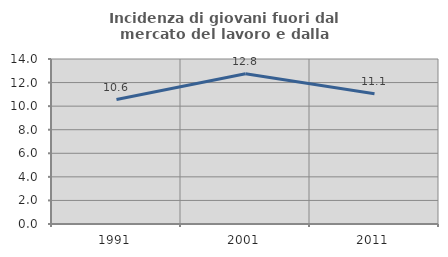
| Category | Incidenza di giovani fuori dal mercato del lavoro e dalla formazione  |
|---|---|
| 1991.0 | 10.558 |
| 2001.0 | 12.755 |
| 2011.0 | 11.054 |